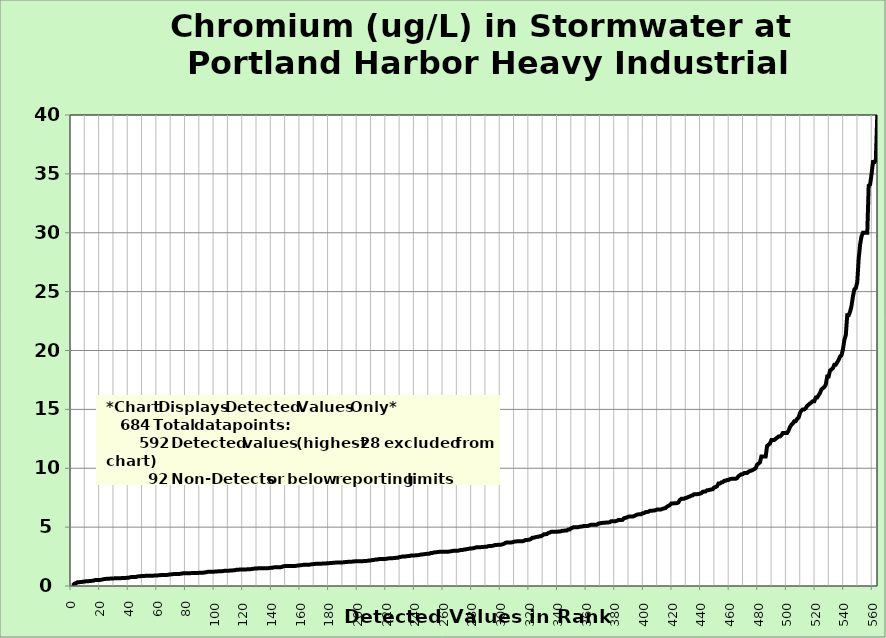
| Category | Chromium |
|---|---|
| 0.0 | 0.068 |
| 1.0 | 0.073 |
| 2.0 | 0.207 |
| 3.0 | 0.228 |
| 4.0 | 0.317 |
| 5.0 | 0.32 |
| 6.0 | 0.335 |
| 7.0 | 0.339 |
| 8.0 | 0.368 |
| 9.0 | 0.38 |
| 10.0 | 0.4 |
| 11.0 | 0.4 |
| 12.0 | 0.414 |
| 13.0 | 0.42 |
| 14.0 | 0.44 |
| 15.0 | 0.447 |
| 16.0 | 0.497 |
| 17.0 | 0.51 |
| 18.0 | 0.51 |
| 19.0 | 0.512 |
| 20.0 | 0.52 |
| 21.0 | 0.544 |
| 22.0 | 0.567 |
| 23.0 | 0.6 |
| 24.0 | 0.606 |
| 25.0 | 0.62 |
| 26.0 | 0.62 |
| 27.0 | 0.63 |
| 28.0 | 0.64 |
| 29.0 | 0.644 |
| 30.0 | 0.65 |
| 31.0 | 0.65 |
| 32.0 | 0.658 |
| 33.0 | 0.66 |
| 34.0 | 0.667 |
| 35.0 | 0.67 |
| 36.0 | 0.67 |
| 37.0 | 0.679 |
| 38.0 | 0.69 |
| 39.0 | 0.71 |
| 40.0 | 0.71 |
| 41.0 | 0.75 |
| 42.0 | 0.76 |
| 43.0 | 0.76 |
| 44.0 | 0.77 |
| 45.0 | 0.77 |
| 46.0 | 0.81 |
| 47.0 | 0.824 |
| 48.0 | 0.83 |
| 49.0 | 0.85 |
| 50.0 | 0.85 |
| 51.0 | 0.856 |
| 52.0 | 0.87 |
| 53.0 | 0.87 |
| 54.0 | 0.87 |
| 55.0 | 0.87 |
| 56.0 | 0.87 |
| 57.0 | 0.878 |
| 58.0 | 0.889 |
| 59.0 | 0.9 |
| 60.0 | 0.9 |
| 61.0 | 0.91 |
| 62.0 | 0.922 |
| 63.0 | 0.932 |
| 64.0 | 0.933 |
| 65.0 | 0.94 |
| 66.0 | 0.94 |
| 67.0 | 0.945 |
| 68.0 | 0.97 |
| 69.0 | 0.978 |
| 70.0 | 1 |
| 71.0 | 1.01 |
| 72.0 | 1.01 |
| 73.0 | 1.02 |
| 74.0 | 1.02 |
| 75.0 | 1.02 |
| 76.0 | 1.04 |
| 77.0 | 1.06 |
| 78.0 | 1.08 |
| 79.0 | 1.08 |
| 80.0 | 1.08 |
| 81.0 | 1.08 |
| 82.0 | 1.09 |
| 83.0 | 1.09 |
| 84.0 | 1.1 |
| 85.0 | 1.1 |
| 86.0 | 1.1 |
| 87.0 | 1.1 |
| 88.0 | 1.1 |
| 89.0 | 1.12 |
| 90.0 | 1.13 |
| 91.0 | 1.13 |
| 92.0 | 1.13 |
| 93.0 | 1.15 |
| 94.0 | 1.17 |
| 95.0 | 1.2 |
| 96.0 | 1.2 |
| 97.0 | 1.2 |
| 98.0 | 1.2 |
| 99.0 | 1.21 |
| 100.0 | 1.22 |
| 101.0 | 1.23 |
| 102.0 | 1.24 |
| 103.0 | 1.25 |
| 104.0 | 1.25 |
| 105.0 | 1.26 |
| 106.0 | 1.27 |
| 107.0 | 1.3 |
| 108.0 | 1.3 |
| 109.0 | 1.3 |
| 110.0 | 1.3 |
| 111.0 | 1.32 |
| 112.0 | 1.32 |
| 113.0 | 1.33 |
| 114.0 | 1.34 |
| 115.0 | 1.38 |
| 116.0 | 1.39 |
| 117.0 | 1.39 |
| 118.0 | 1.4 |
| 119.0 | 1.4 |
| 120.0 | 1.4 |
| 121.0 | 1.41 |
| 122.0 | 1.41 |
| 123.0 | 1.42 |
| 124.0 | 1.43 |
| 125.0 | 1.43 |
| 126.0 | 1.44 |
| 127.0 | 1.47 |
| 128.0 | 1.48 |
| 129.0 | 1.48 |
| 130.0 | 1.5 |
| 131.0 | 1.5 |
| 132.0 | 1.5 |
| 133.0 | 1.5 |
| 134.0 | 1.51 |
| 135.0 | 1.51 |
| 136.0 | 1.51 |
| 137.0 | 1.51 |
| 138.0 | 1.53 |
| 139.0 | 1.54 |
| 140.0 | 1.55 |
| 141.0 | 1.57 |
| 142.0 | 1.6 |
| 143.0 | 1.6 |
| 144.0 | 1.6 |
| 145.0 | 1.6 |
| 146.0 | 1.6 |
| 147.0 | 1.63 |
| 148.0 | 1.68 |
| 149.0 | 1.69 |
| 150.0 | 1.69 |
| 151.0 | 1.7 |
| 152.0 | 1.7 |
| 153.0 | 1.7 |
| 154.0 | 1.7 |
| 155.0 | 1.7 |
| 156.0 | 1.7 |
| 157.0 | 1.72 |
| 158.0 | 1.74 |
| 159.0 | 1.75 |
| 160.0 | 1.76 |
| 161.0 | 1.78 |
| 162.0 | 1.8 |
| 163.0 | 1.8 |
| 164.0 | 1.8 |
| 165.0 | 1.8 |
| 166.0 | 1.81 |
| 167.0 | 1.83 |
| 168.0 | 1.85 |
| 169.0 | 1.86 |
| 170.0 | 1.87 |
| 171.0 | 1.9 |
| 172.0 | 1.9 |
| 173.0 | 1.9 |
| 174.0 | 1.9 |
| 175.0 | 1.9 |
| 176.0 | 1.91 |
| 177.0 | 1.92 |
| 178.0 | 1.92 |
| 179.0 | 1.94 |
| 180.0 | 1.94 |
| 181.0 | 1.96 |
| 182.0 | 1.96 |
| 183.0 | 1.97 |
| 184.0 | 1.98 |
| 185.0 | 2 |
| 186.0 | 2 |
| 187.0 | 2 |
| 188.0 | 2 |
| 189.0 | 2 |
| 190.0 | 2.01 |
| 191.0 | 2.03 |
| 192.0 | 2.04 |
| 193.0 | 2.05 |
| 194.0 | 2.07 |
| 195.0 | 2.07 |
| 196.0 | 2.07 |
| 197.0 | 2.08 |
| 198.0 | 2.1 |
| 199.0 | 2.1 |
| 200.0 | 2.1 |
| 201.0 | 2.1 |
| 202.0 | 2.1 |
| 203.0 | 2.1 |
| 204.0 | 2.12 |
| 205.0 | 2.13 |
| 206.0 | 2.13 |
| 207.0 | 2.14 |
| 208.0 | 2.17 |
| 209.0 | 2.17 |
| 210.0 | 2.2 |
| 211.0 | 2.2 |
| 212.0 | 2.24 |
| 213.0 | 2.25 |
| 214.0 | 2.26 |
| 215.0 | 2.3 |
| 216.0 | 2.3 |
| 217.0 | 2.3 |
| 218.0 | 2.3 |
| 219.0 | 2.3 |
| 220.0 | 2.31 |
| 221.0 | 2.34 |
| 222.0 | 2.35 |
| 223.0 | 2.35 |
| 224.0 | 2.36 |
| 225.0 | 2.37 |
| 226.0 | 2.38 |
| 227.0 | 2.4 |
| 228.0 | 2.4 |
| 229.0 | 2.46 |
| 230.0 | 2.47 |
| 231.0 | 2.5 |
| 232.0 | 2.5 |
| 233.0 | 2.5 |
| 234.0 | 2.53 |
| 235.0 | 2.54 |
| 236.0 | 2.54 |
| 237.0 | 2.59 |
| 238.0 | 2.6 |
| 239.0 | 2.6 |
| 240.0 | 2.6 |
| 241.0 | 2.62 |
| 242.0 | 2.62 |
| 243.0 | 2.64 |
| 244.0 | 2.67 |
| 245.0 | 2.67 |
| 246.0 | 2.7 |
| 247.0 | 2.71 |
| 248.0 | 2.73 |
| 249.0 | 2.74 |
| 250.0 | 2.75 |
| 251.0 | 2.8 |
| 252.0 | 2.8 |
| 253.0 | 2.85 |
| 254.0 | 2.86 |
| 255.0 | 2.87 |
| 256.0 | 2.89 |
| 257.0 | 2.9 |
| 258.0 | 2.9 |
| 259.0 | 2.9 |
| 260.0 | 2.9 |
| 261.0 | 2.9 |
| 262.0 | 2.91 |
| 263.0 | 2.91 |
| 264.0 | 2.93 |
| 265.0 | 2.95 |
| 266.0 | 2.97 |
| 267.0 | 3 |
| 268.0 | 3 |
| 269.0 | 3 |
| 270.0 | 3 |
| 271.0 | 3.03 |
| 272.0 | 3.06 |
| 273.0 | 3.06 |
| 274.0 | 3.09 |
| 275.0 | 3.1 |
| 276.0 | 3.13 |
| 277.0 | 3.14 |
| 278.0 | 3.18 |
| 279.0 | 3.18 |
| 280.0 | 3.2 |
| 281.0 | 3.21 |
| 282.0 | 3.26 |
| 283.0 | 3.29 |
| 284.0 | 3.29 |
| 285.0 | 3.3 |
| 286.0 | 3.3 |
| 287.0 | 3.32 |
| 288.0 | 3.32 |
| 289.0 | 3.33 |
| 290.0 | 3.33 |
| 291.0 | 3.38 |
| 292.0 | 3.4 |
| 293.0 | 3.4 |
| 294.0 | 3.41 |
| 295.0 | 3.44 |
| 296.0 | 3.48 |
| 297.0 | 3.48 |
| 298.0 | 3.5 |
| 299.0 | 3.5 |
| 300.0 | 3.51 |
| 301.0 | 3.54 |
| 302.0 | 3.58 |
| 303.0 | 3.65 |
| 304.0 | 3.7 |
| 305.0 | 3.7 |
| 306.0 | 3.7 |
| 307.0 | 3.7 |
| 308.0 | 3.71 |
| 309.0 | 3.76 |
| 310.0 | 3.78 |
| 311.0 | 3.79 |
| 312.0 | 3.8 |
| 313.0 | 3.8 |
| 314.0 | 3.8 |
| 315.0 | 3.8 |
| 316.0 | 3.83 |
| 317.0 | 3.9 |
| 318.0 | 3.9 |
| 319.0 | 3.92 |
| 320.0 | 3.94 |
| 321.0 | 4 |
| 322.0 | 4.1 |
| 323.0 | 4.1 |
| 324.0 | 4.14 |
| 325.0 | 4.17 |
| 326.0 | 4.18 |
| 327.0 | 4.22 |
| 328.0 | 4.23 |
| 329.0 | 4.3 |
| 330.0 | 4.39 |
| 331.0 | 4.4 |
| 332.0 | 4.41 |
| 333.0 | 4.5 |
| 334.0 | 4.54 |
| 335.0 | 4.6 |
| 336.0 | 4.6 |
| 337.0 | 4.6 |
| 338.0 | 4.6 |
| 339.0 | 4.6 |
| 340.0 | 4.62 |
| 341.0 | 4.63 |
| 342.0 | 4.65 |
| 343.0 | 4.7 |
| 344.0 | 4.7 |
| 345.0 | 4.71 |
| 346.0 | 4.72 |
| 347.0 | 4.8 |
| 348.0 | 4.8 |
| 349.0 | 4.9 |
| 350.0 | 4.95 |
| 351.0 | 5 |
| 352.0 | 5 |
| 353.0 | 5 |
| 354.0 | 5 |
| 355.0 | 5.03 |
| 356.0 | 5.05 |
| 357.0 | 5.06 |
| 358.0 | 5.1 |
| 359.0 | 5.1 |
| 360.0 | 5.1 |
| 361.0 | 5.11 |
| 362.0 | 5.17 |
| 363.0 | 5.2 |
| 364.0 | 5.2 |
| 365.0 | 5.2 |
| 366.0 | 5.21 |
| 367.0 | 5.21 |
| 368.0 | 5.3 |
| 369.0 | 5.32 |
| 370.0 | 5.35 |
| 371.0 | 5.36 |
| 372.0 | 5.38 |
| 373.0 | 5.38 |
| 374.0 | 5.4 |
| 375.0 | 5.4 |
| 376.0 | 5.41 |
| 377.0 | 5.5 |
| 378.0 | 5.5 |
| 379.0 | 5.5 |
| 380.0 | 5.5 |
| 381.0 | 5.54 |
| 382.0 | 5.6 |
| 383.0 | 5.6 |
| 384.0 | 5.6 |
| 385.0 | 5.62 |
| 386.0 | 5.76 |
| 387.0 | 5.79 |
| 388.0 | 5.82 |
| 389.0 | 5.89 |
| 390.0 | 5.9 |
| 391.0 | 5.9 |
| 392.0 | 5.9 |
| 393.0 | 5.94 |
| 394.0 | 6 |
| 395.0 | 6.06 |
| 396.0 | 6.08 |
| 397.0 | 6.1 |
| 398.0 | 6.1 |
| 399.0 | 6.18 |
| 400.0 | 6.19 |
| 401.0 | 6.27 |
| 402.0 | 6.29 |
| 403.0 | 6.3 |
| 404.0 | 6.38 |
| 405.0 | 6.4 |
| 406.0 | 6.4 |
| 407.0 | 6.41 |
| 408.0 | 6.44 |
| 409.0 | 6.49 |
| 410.0 | 6.5 |
| 411.0 | 6.5 |
| 412.0 | 6.5 |
| 413.0 | 6.56 |
| 414.0 | 6.59 |
| 415.0 | 6.62 |
| 416.0 | 6.74 |
| 417.0 | 6.8 |
| 418.0 | 6.87 |
| 419.0 | 7 |
| 420.0 | 7 |
| 421.0 | 7.03 |
| 422.0 | 7.03 |
| 423.0 | 7.04 |
| 424.0 | 7.1 |
| 425.0 | 7.31 |
| 426.0 | 7.4 |
| 427.0 | 7.4 |
| 428.0 | 7.41 |
| 429.0 | 7.48 |
| 430.0 | 7.5 |
| 431.0 | 7.57 |
| 432.0 | 7.6 |
| 433.0 | 7.67 |
| 434.0 | 7.7 |
| 435.0 | 7.8 |
| 436.0 | 7.8 |
| 437.0 | 7.8 |
| 438.0 | 7.81 |
| 439.0 | 7.84 |
| 440.0 | 7.88 |
| 441.0 | 8 |
| 442.0 | 8.02 |
| 443.0 | 8.03 |
| 444.0 | 8.13 |
| 445.0 | 8.14 |
| 446.0 | 8.17 |
| 447.0 | 8.2 |
| 448.0 | 8.22 |
| 449.0 | 8.37 |
| 450.0 | 8.4 |
| 451.0 | 8.47 |
| 452.0 | 8.7 |
| 453.0 | 8.7 |
| 454.0 | 8.8 |
| 455.0 | 8.82 |
| 456.0 | 8.93 |
| 457.0 | 8.94 |
| 458.0 | 9 |
| 459.0 | 9 |
| 460.0 | 9.08 |
| 461.0 | 9.1 |
| 462.0 | 9.1 |
| 463.0 | 9.1 |
| 464.0 | 9.1 |
| 465.0 | 9.16 |
| 466.0 | 9.33 |
| 467.0 | 9.41 |
| 468.0 | 9.49 |
| 469.0 | 9.5 |
| 470.0 | 9.59 |
| 471.0 | 9.6 |
| 472.0 | 9.6 |
| 473.0 | 9.7 |
| 474.0 | 9.76 |
| 475.0 | 9.8 |
| 476.0 | 9.85 |
| 477.0 | 9.93 |
| 478.0 | 10 |
| 479.0 | 10.3 |
| 480.0 | 10.4 |
| 481.0 | 10.5 |
| 482.0 | 11 |
| 483.0 | 11 |
| 484.0 | 11 |
| 485.0 | 11 |
| 486.0 | 11.9 |
| 487.0 | 12 |
| 488.0 | 12.1 |
| 489.0 | 12.4 |
| 490.0 | 12.4 |
| 491.0 | 12.4 |
| 492.0 | 12.5 |
| 493.0 | 12.6 |
| 494.0 | 12.7 |
| 495.0 | 12.7 |
| 496.0 | 12.8 |
| 497.0 | 13 |
| 498.0 | 13 |
| 499.0 | 13 |
| 500.0 | 13 |
| 501.0 | 13.2 |
| 502.0 | 13.5 |
| 503.0 | 13.7 |
| 504.0 | 13.8 |
| 505.0 | 14 |
| 506.0 | 14 |
| 507.0 | 14.2 |
| 508.0 | 14.3 |
| 509.0 | 14.7 |
| 510.0 | 14.9 |
| 511.0 | 15 |
| 512.0 | 15 |
| 513.0 | 15.1 |
| 514.0 | 15.3 |
| 515.0 | 15.4 |
| 516.0 | 15.5 |
| 517.0 | 15.6 |
| 518.0 | 15.7 |
| 519.0 | 15.7 |
| 520.0 | 16 |
| 521.0 | 16 |
| 522.0 | 16.2 |
| 523.0 | 16.4 |
| 524.0 | 16.7 |
| 525.0 | 16.8 |
| 526.0 | 16.9 |
| 527.0 | 17.1 |
| 528.0 | 17.8 |
| 529.0 | 17.8 |
| 530.0 | 18.3 |
| 531.0 | 18.4 |
| 532.0 | 18.5 |
| 533.0 | 18.8 |
| 534.0 | 18.8 |
| 535.0 | 19 |
| 536.0 | 19.2 |
| 537.0 | 19.5 |
| 538.0 | 19.6 |
| 539.0 | 20.1 |
| 540.0 | 20.9 |
| 541.0 | 21.3 |
| 542.0 | 23 |
| 543.0 | 23 |
| 544.0 | 23.3 |
| 545.0 | 23.8 |
| 546.0 | 24.6 |
| 547.0 | 25.2 |
| 548.0 | 25.3 |
| 549.0 | 25.8 |
| 550.0 | 27.8 |
| 551.0 | 29 |
| 552.0 | 29.7 |
| 553.0 | 30 |
| 554.0 | 30 |
| 555.0 | 30 |
| 556.0 | 30 |
| 557.0 | 34 |
| 558.0 | 34.1 |
| 559.0 | 35 |
| 560.0 | 36 |
| 561.0 | 36 |
| 562.0 | 36.2 |
| 563.0 | 40 |